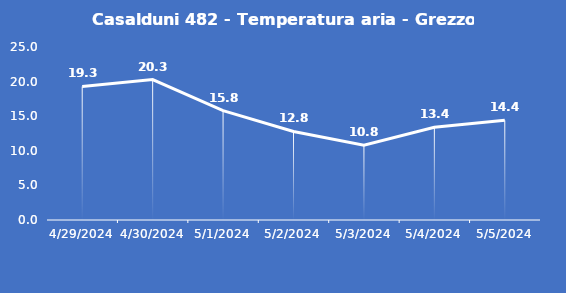
| Category | Casalduni 482 - Temperatura aria - Grezzo (°C) |
|---|---|
| 4/29/24 | 19.3 |
| 4/30/24 | 20.3 |
| 5/1/24 | 15.8 |
| 5/2/24 | 12.8 |
| 5/3/24 | 10.8 |
| 5/4/24 | 13.4 |
| 5/5/24 | 14.4 |